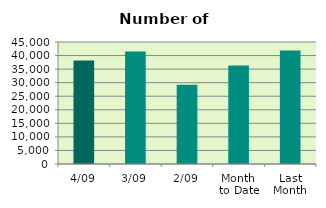
| Category | Series 0 |
|---|---|
| 4/09 | 38204 |
| 3/09 | 41514 |
| 2/09 | 29246 |
| Month 
to Date | 36321.333 |
| Last
Month | 41849.545 |